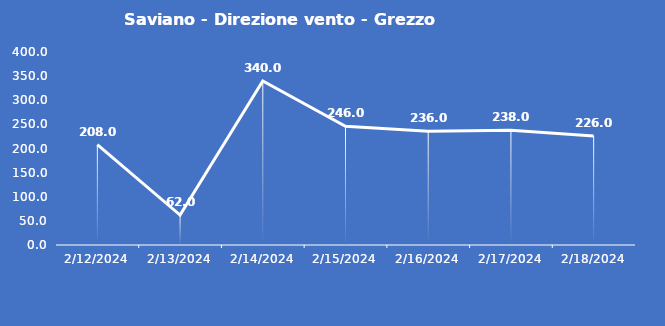
| Category | Saviano - Direzione vento - Grezzo (°N) |
|---|---|
| 2/12/24 | 208 |
| 2/13/24 | 62 |
| 2/14/24 | 340 |
| 2/15/24 | 246 |
| 2/16/24 | 236 |
| 2/17/24 | 238 |
| 2/18/24 | 226 |